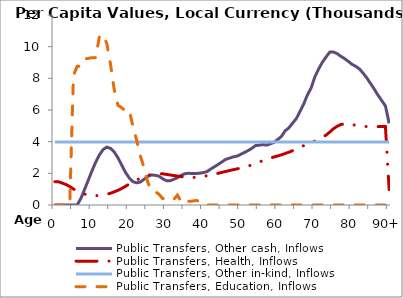
| Category | Public Transfers, Other cash, Inflows | Public Transfers, Health, Inflows | Public Transfers, Other in-kind, Inflows | Public Transfers, Education, Inflows |
|---|---|---|---|---|
| 0 | 0 | 1474.172 | 3982.65 | 0 |
|  | 0 | 1462.29 | 3982.65 | 0 |
| 2 | 0 | 1383.618 | 3982.65 | 0 |
| 3 | 0 | 1292.467 | 3982.65 | 0 |
| 4 | 0 | 1166.096 | 3982.65 | 0 |
| 5 | 0 | 1010.11 | 3982.65 | 8172.319 |
| 6 | 0 | 877.3 | 3982.65 | 8759.01 |
| 7 | 410.678 | 770.473 | 3982.65 | 8769.333 |
| 8 | 982.243 | 689.754 | 3982.65 | 9216.91 |
| 9 | 1566.766 | 633.258 | 3982.65 | 9263.561 |
| 10 | 2158.609 | 602.947 | 3982.65 | 9303.831 |
| 11 | 2708.461 | 591.37 | 3982.65 | 9309.474 |
| 12 | 3166.828 | 601.671 | 3982.65 | 10660.905 |
| 13 | 3505.066 | 629.637 | 3982.65 | 10750.253 |
| 14 | 3656.156 | 678.122 | 3982.65 | 10185.986 |
| 15 | 3572.392 | 746.317 | 3982.65 | 8858.244 |
| 16 | 3344.856 | 831.982 | 3982.65 | 7264.809 |
| 17 | 2978.951 | 930.3 | 3982.65 | 6295.462 |
| 18 | 2522.725 | 1045.395 | 3982.65 | 6147.146 |
| 19 | 2064.919 | 1177.231 | 3982.65 | 5929.916 |
| 20 | 1719.398 | 1322.249 | 3982.65 | 5992.13 |
| 21 | 1479.676 | 1455.213 | 3982.65 | 5003.741 |
| 22 | 1399.496 | 1576.136 | 3982.65 | 4108.928 |
| 23 | 1445.296 | 1685.788 | 3982.65 | 3122.472 |
| 24 | 1624.691 | 1782.727 | 3982.65 | 2354.657 |
| 25 | 1799.529 | 1870.143 | 3982.65 | 1443.056 |
| 26 | 1898.808 | 1933.367 | 3982.65 | 913.166 |
| 27 | 1876.396 | 1971.645 | 3982.65 | 845.4 |
| 28 | 1825.996 | 1982.164 | 3982.65 | 690.647 |
| 29 | 1659.728 | 1970.82 | 3982.65 | 407.805 |
| 30 | 1538.802 | 1933.738 | 3982.65 | 426.623 |
| 31 | 1526.312 | 1898.269 | 3982.65 | 321.395 |
| 32 | 1622.978 | 1862.988 | 3982.65 | 345.156 |
| 33 | 1720.144 | 1828.092 | 3982.65 | 622.592 |
| 34 | 1869.593 | 1794.344 | 3982.65 | 219.627 |
| 35 | 1977.136 | 1760.799 | 3982.65 | 380.961 |
| 36 | 2003.333 | 1742.342 | 3982.65 | 231.286 |
| 37 | 1984.652 | 1736.795 | 3982.65 | 248.364 |
| 38 | 1990.897 | 1746.559 | 3982.65 | 282.449 |
| 39 | 2010.14 | 1770.546 | 3982.65 | 258.668 |
| 40 | 2046.746 | 1808.579 | 3982.65 | 216.742 |
| 41 | 2115.31 | 1850.951 | 3982.65 | 0 |
| 42 | 2275.317 | 1897.812 | 3982.65 | 0 |
| 43 | 2420.1 | 1948.053 | 3982.65 | 0 |
| 44 | 2569.091 | 2003.213 | 3982.65 | 0 |
| 45 | 2723.667 | 2062.25 | 3982.65 | 0 |
| 46 | 2878.437 | 2119.248 | 3982.65 | 0 |
| 47 | 2959.959 | 2174.134 | 3982.65 | 0 |
| 48 | 3036.621 | 2227.391 | 3982.65 | 0 |
| 49 | 3081.495 | 2278.843 | 3982.65 | 0 |
| 50 | 3194.216 | 2328.22 | 3982.65 | 0 |
| 51 | 3314.555 | 2385.44 | 3982.65 | 0 |
| 52 | 3434.452 | 2455.697 | 3982.65 | 0 |
| 53 | 3573.864 | 2530.246 | 3982.65 | 0 |
| 54 | 3751.114 | 2617.7 | 3982.65 | 0 |
| 55 | 3779.544 | 2713.253 | 3982.65 | 0 |
| 56 | 3813.522 | 2803.64 | 3982.65 | 0 |
| 57 | 3780.583 | 2887.181 | 3982.65 | 0 |
| 58 | 3866.856 | 2962.528 | 3982.65 | 0 |
| 59 | 3952.129 | 3035.181 | 3982.65 | 0 |
| 60 | 4139.042 | 3099.784 | 3982.65 | 0 |
| 61 | 4328.892 | 3169.855 | 3982.65 | 0 |
| 62 | 4686.077 | 3250.382 | 3982.65 | 0 |
| 63 | 4874.219 | 3333.43 | 3982.65 | 0 |
| 64 | 5167.457 | 3430.103 | 3982.65 | 0 |
| 65 | 5453.504 | 3536.646 | 3982.65 | 0 |
| 66 | 5909.104 | 3644.074 | 3982.65 | 0 |
| 67 | 6380.988 | 3748.184 | 3982.65 | 0 |
| 68 | 6950.6 | 3851.176 | 3982.65 | 0 |
| 69 | 7399.161 | 3949.827 | 3982.65 | 0 |
| 70 | 8091.852 | 4037.358 | 3982.65 | 0 |
| 71 | 8584.81 | 4138.695 | 3982.65 | 0 |
| 72 | 9006.619 | 4265.665 | 3982.65 | 0 |
| 73 | 9343.926 | 4413.555 | 3982.65 | 0 |
| 74 | 9655.513 | 4602.603 | 3982.65 | 0 |
| 75 | 9659.962 | 4816.88 | 3982.65 | 0 |
| 76 | 9560.674 | 4972.182 | 3982.65 | 0 |
| 77 | 9388.715 | 5081.245 | 3982.65 | 0 |
| 78 | 9244.205 | 5136.988 | 3982.65 | 0 |
| 79 | 9072.517 | 5142.841 | 3982.65 | 0 |
| 80 | 8886.066 | 5080.464 | 3982.65 | 0 |
| 81 | 8759.94 | 5030.779 | 3982.65 | 0 |
| 82 | 8592.839 | 4994.139 | 3982.65 | 0 |
| 83 | 8321.995 | 4964.546 | 3982.65 | 0 |
| 84 | 8022.099 | 4954.352 | 3982.65 | 0 |
| 85 | 7674.437 | 4954.352 | 3982.65 | 0 |
| 86 | 7316.079 | 4954.352 | 3982.65 | 0 |
| 87 | 6934.855 | 4954.352 | 3982.65 | 0 |
| 88 | 6594.172 | 4954.352 | 3982.65 | 0 |
| 89 | 6261.682 | 4954.352 | 3982.65 | 0 |
| 90+ | 5154.084 | 976.744 | 3982.65 | 0 |